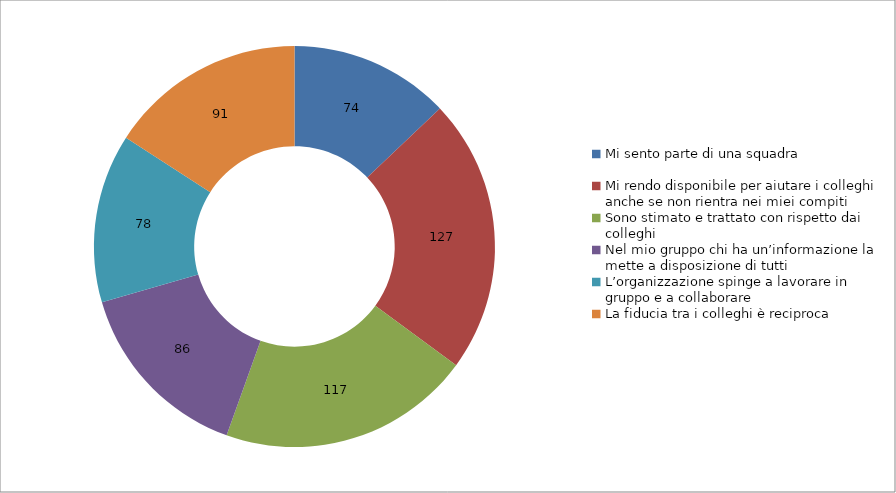
| Category | Series 0 |
|---|---|
| Mi sento parte di una squadra | 74 |
| Mi rendo disponibile per aiutare i colleghi anche se non rientra nei miei compiti | 127 |
| Sono stimato e trattato con rispetto dai colleghi | 117 |
| Nel mio gruppo chi ha un’informazione la mette a disposizione di tutti | 86 |
| L’organizzazione spinge a lavorare in gruppo e a collaborare  | 78 |
| La fiducia tra i colleghi è reciproca | 91 |